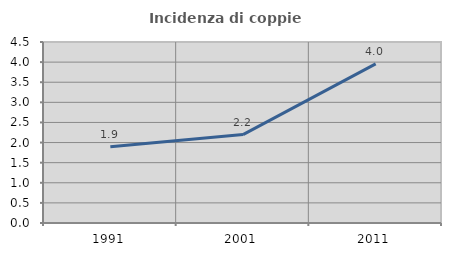
| Category | Incidenza di coppie miste |
|---|---|
| 1991.0 | 1.895 |
| 2001.0 | 2.198 |
| 2011.0 | 3.958 |